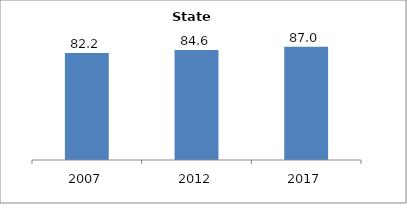
| Category | Series 0 |
|---|---|
| 2007.0 | 82.219 |
| 2012.0 | 84.554 |
| 2017.0 | 87.044 |